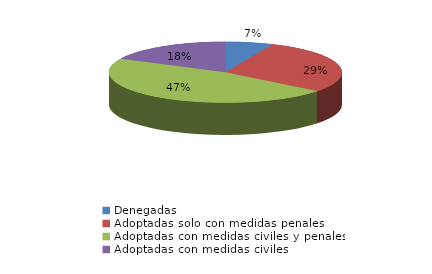
| Category | Series 0 |
|---|---|
| Denegadas | 56 |
| Adoptadas solo con medidas penales | 248 |
| Adoptadas con medidas civiles y penales | 398 |
| Adoptadas con medidas civiles | 150 |